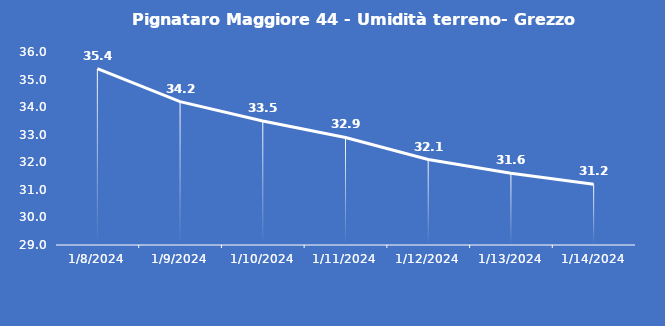
| Category | Pignataro Maggiore 44 - Umidità terreno- Grezzo (%VWC) |
|---|---|
| 1/8/24 | 35.4 |
| 1/9/24 | 34.2 |
| 1/10/24 | 33.5 |
| 1/11/24 | 32.9 |
| 1/12/24 | 32.1 |
| 1/13/24 | 31.6 |
| 1/14/24 | 31.2 |